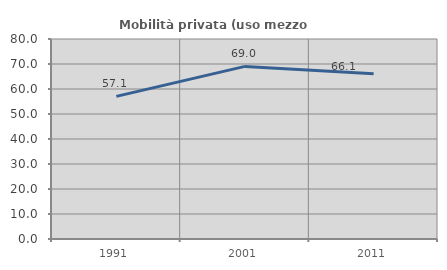
| Category | Mobilità privata (uso mezzo privato) |
|---|---|
| 1991.0 | 57.061 |
| 2001.0 | 69.043 |
| 2011.0 | 66.112 |